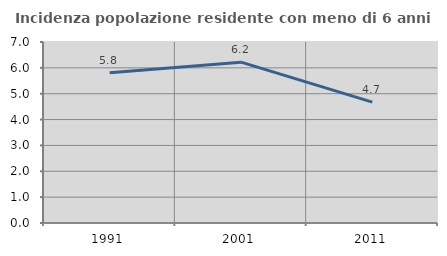
| Category | Incidenza popolazione residente con meno di 6 anni |
|---|---|
| 1991.0 | 5.813 |
| 2001.0 | 6.22 |
| 2011.0 | 4.674 |